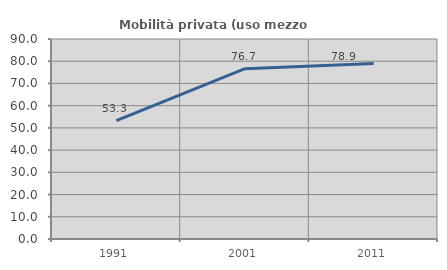
| Category | Mobilità privata (uso mezzo privato) |
|---|---|
| 1991.0 | 53.315 |
| 2001.0 | 76.656 |
| 2011.0 | 78.947 |